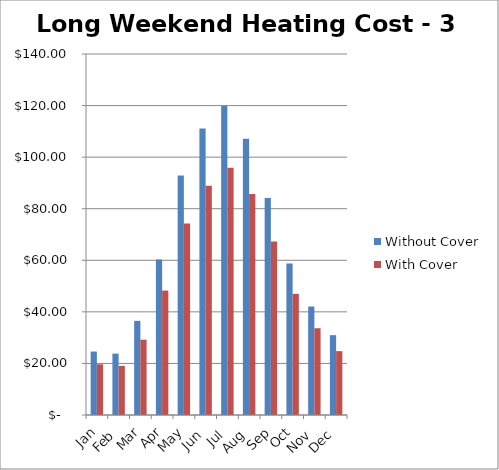
| Category | Without Cover | With Cover |
|---|---|---|
| Jan | 24.606 | 19.685 |
| Feb | 23.812 | 19.05 |
| Mar | 36.512 | 29.209 |
| Apr | 60.324 | 48.259 |
| May | 92.867 | 74.294 |
| Jun | 111.123 | 88.898 |
| Jul | 119.854 | 95.883 |
| Aug | 107.154 | 85.723 |
| Sep | 84.136 | 67.309 |
| Oct | 58.736 | 46.989 |
| Nov | 42.068 | 33.654 |
| Dec | 30.956 | 24.765 |